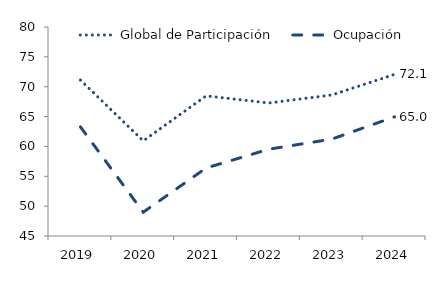
| Category | Global de Participación | Ocupación |
|---|---|---|
| 2019.0 | 71.115 | 63.278 |
| 2020.0 | 60.932 | 48.985 |
| 2021.0 | 68.465 | 56.389 |
| 2022.0 | 67.275 | 59.536 |
| 2023.0 | 68.612 | 61.223 |
| 2024.0 | 72.063 | 64.958 |